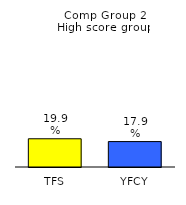
| Category | Series 0 |
|---|---|
| TFS | 0.199 |
| YFCY | 0.179 |